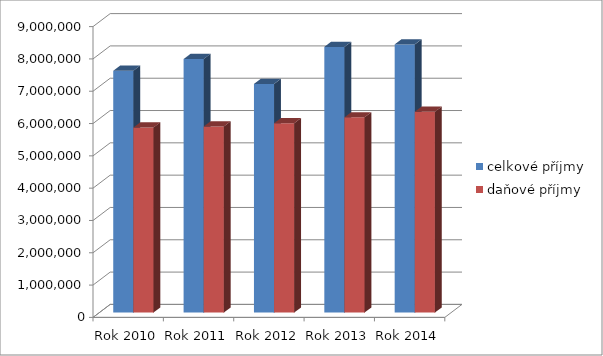
| Category | celkové příjmy | daňové příjmy |
|---|---|---|
| Rok 2010 | 7483733 | 5726531 |
| Rok 2011 | 7847089 | 5759434 |
| Rok 2012 | 7077264 | 5860476 |
| Rok 2013 | 8223972 | 6042400 |
| Rok 2014 | 8301489 | 6216584 |